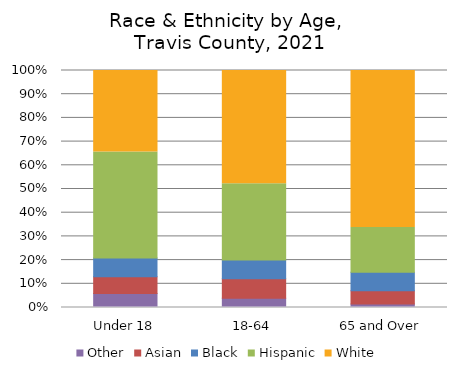
| Category | Other | Asian | Black | Hispanic | White |
|---|---|---|---|---|---|
| Under 18 | 0.06 | 0.07 | 0.079 | 0.447 | 0.344 |
| 18-64 | 0.039 | 0.082 | 0.079 | 0.322 | 0.478 |
| 65 and Over | 0.014 | 0.056 | 0.079 | 0.188 | 0.663 |